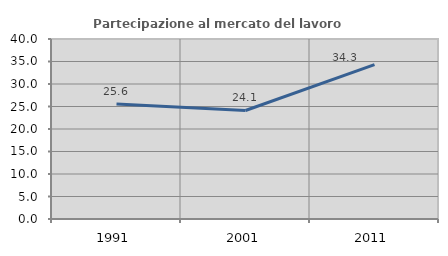
| Category | Partecipazione al mercato del lavoro  femminile |
|---|---|
| 1991.0 | 25.562 |
| 2001.0 | 24.115 |
| 2011.0 | 34.293 |